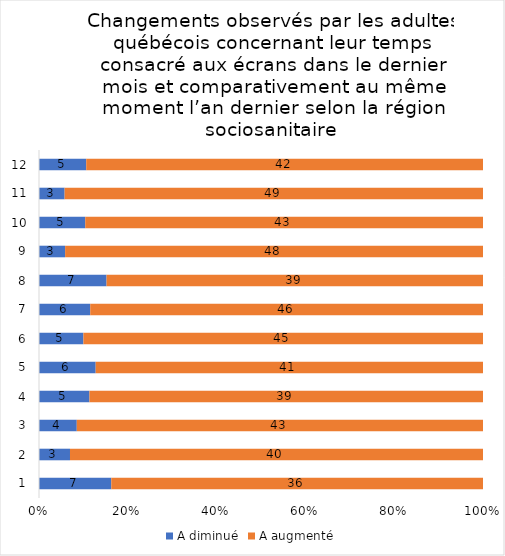
| Category | A diminué | A augmenté |
|---|---|---|
| 0 | 7 | 36 |
| 1 | 3 | 40 |
| 2 | 4 | 43 |
| 3 | 5 | 39 |
| 4 | 6 | 41 |
| 5 | 5 | 45 |
| 6 | 6 | 46 |
| 7 | 7 | 39 |
| 8 | 3 | 48 |
| 9 | 5 | 43 |
| 10 | 3 | 49 |
| 11 | 5 | 42 |